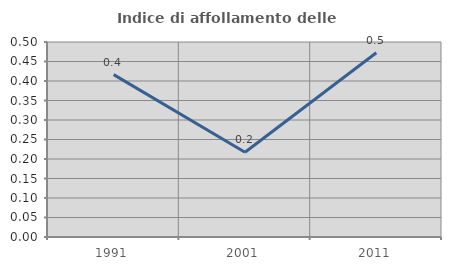
| Category | Indice di affollamento delle abitazioni  |
|---|---|
| 1991.0 | 0.416 |
| 2001.0 | 0.217 |
| 2011.0 | 0.472 |